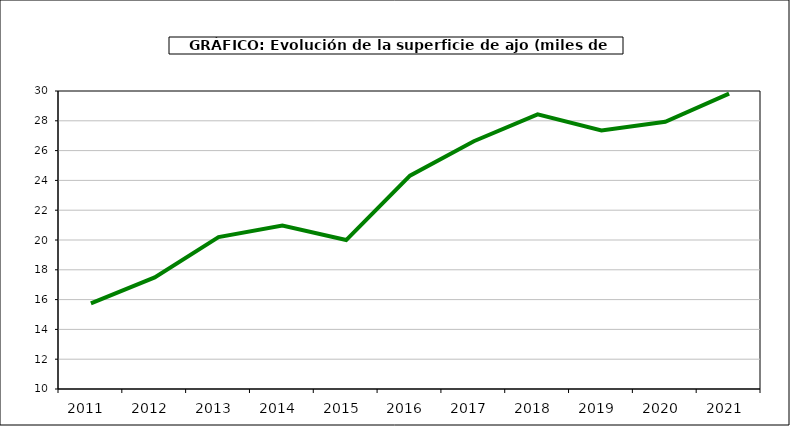
| Category | superficie |
|---|---|
| 2011.0 | 15.75 |
| 2012.0 | 17.494 |
| 2013.0 | 20.197 |
| 2014.0 | 20.965 |
| 2015.0 | 19.996 |
| 2016.0 | 24.317 |
| 2017.0 | 26.63 |
| 2018.0 | 28.428 |
| 2019.0 | 27.348 |
| 2020.0 | 27.937 |
| 2021.0 | 29.826 |